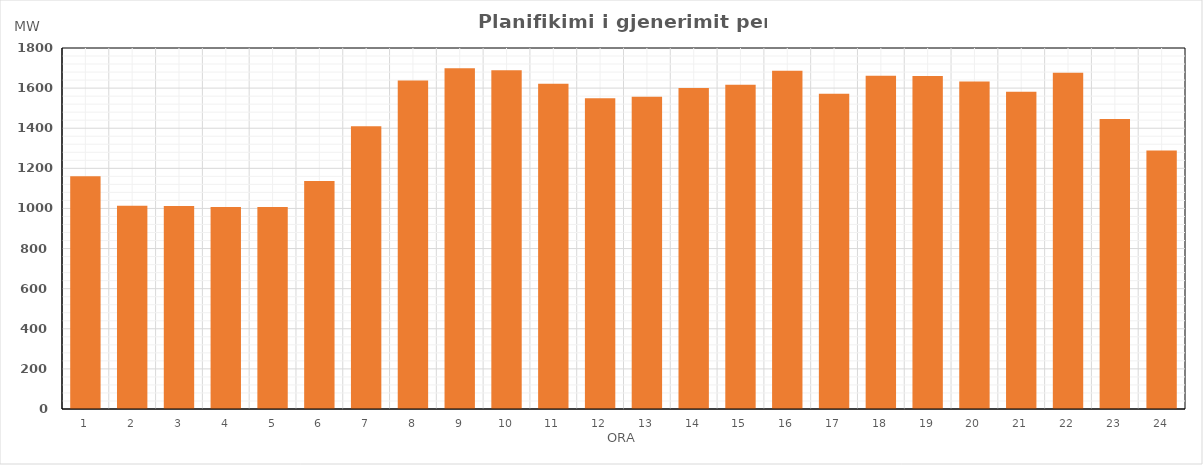
| Category | Max (MW) |
|---|---|
| 0 | 1160.11 |
| 1 | 1013.06 |
| 2 | 1012.47 |
| 3 | 1006.61 |
| 4 | 1006.94 |
| 5 | 1137.42 |
| 6 | 1409.78 |
| 7 | 1637.82 |
| 8 | 1699.55 |
| 9 | 1688.73 |
| 10 | 1621.58 |
| 11 | 1549.11 |
| 12 | 1557.27 |
| 13 | 1600.31 |
| 14 | 1616.24 |
| 15 | 1686.29 |
| 16 | 1572.43 |
| 17 | 1661.24 |
| 18 | 1659.95 |
| 19 | 1632.78 |
| 20 | 1582 |
| 21 | 1675.99 |
| 22 | 1445.68 |
| 23 | 1289.51 |